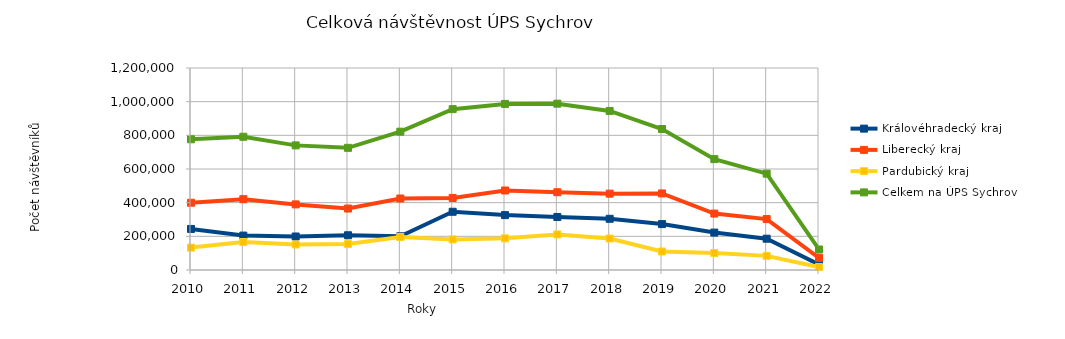
| Category | Královéhradecký kraj | Liberecký kraj | Pardubický kraj | Celkem na ÚPS Sychrov |
|---|---|---|---|---|
| 2010.0 | 243910 | 399672 | 133004 | 776586 |
| 2011.0 | 204481 | 420780 | 166238 | 791499 |
| 2012.0 | 199025 | 389781 | 151509 | 740315 |
| 2013.0 | 206419 | 365108 | 154165 | 725692 |
| 2014.0 | 200438 | 424718 | 196473 | 821629 |
| 2015.0 | 345970 | 428023 | 181567 | 955560 |
| 2016.0 | 326137 | 472318 | 188108 | 986563 |
| 2017.0 | 314983 | 461803 | 211268 | 988054 |
| 2018.0 | 304267 | 453568 | 187017 | 944852 |
| 2019.0 | 272720 | 454785 | 109949 | 837454 |
| 2020.0 | 222238 | 335261 | 101211 | 658710 |
| 2021.0 | 185934 | 302574 | 83925 | 572433 |
| 2022.0 | 32471 | 72013 | 17435 | 121919 |